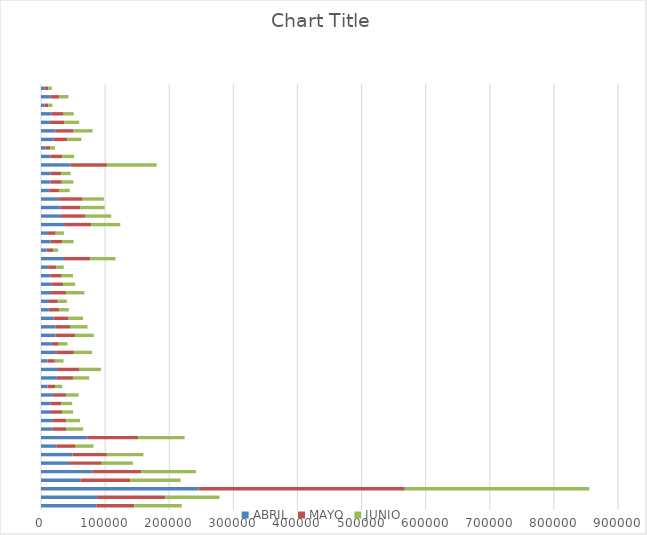
| Category | ABRIL | MAYO | JUNIO |
|---|---|---|---|
| 0 | 86225 | 59291 | 74128 |
| 1 | 88792 | 104839 | 84714 |
| 2 | 245872 | 321637 | 287723 |
| 3 | 61897 | 77159 | 78760 |
| 4 | 80103 | 75978 | 85643 |
| 5 | 43756 | 50997 | 48631 |
| 6 | 49025 | 53799 | 56860 |
| 7 | 24566 | 29308 | 28075 |
| 8 | 72175 | 79440 | 72378 |
| 9 | 17647 | 22268 | 25756 |
| 10 | 18534 | 20859 | 21446 |
| 11 | 15484 | 17320 | 17343 |
| 12 | 15157 | 16817 | 16644 |
| 13 | 18486 | 20451 | 19843 |
| 14 | 10235 | 11541 | 11129 |
| 15 | 24727 | 25111 | 25236 |
| 16 | 26568 | 32729 | 34204 |
| 17 | 9833 | 11752 | 13587 |
| 18 | 23521 | 27748 | 28431 |
| 19 | 16677 | 10917 | 13701 |
| 20 | 22634 | 31226 | 28515 |
| 21 | 22764 | 22472 | 27422 |
| 22 | 19506 | 22751 | 23171 |
| 23 | 12160 | 16334 | 14935 |
| 24 | 12395 | 13765 | 14204 |
| 25 | 15525 | 24156 | 27900 |
| 26 | 15955 | 18739 | 18482 |
| 27 | 14685 | 17695 | 17401 |
| 28 | 11313 | 12295 | 11861 |
| 29 | 35905 | 40641 | 39746 |
| 30 | 8773 | 9931 | 8058 |
| 31 | 14985 | 18104 | 17734 |
| 32 | 10891 | 12007 | 12739 |
| 33 | 37542 | 40806 | 45301 |
| 34 | 31139 | 37465 | 40890 |
| 35 | 30650 | 31029 | 37550 |
| 36 | 28268 | 36654 | 33140 |
| 37 | 12865 | 15134 | 16903 |
| 38 | 14832 | 17660 | 18005 |
| 39 | 14505 | 16748 | 14774 |
| 40 | 46043 | 57431 | 76914 |
| 41 | 15020 | 18138 | 18340 |
| 42 | 6774 | 7507 | 7499 |
| 43 | 19048 | 21789 | 22202 |
| 44 | 22983 | 27884 | 29571 |
| 45 | 13841 | 22243 | 23487 |
| 46 | 16269 | 18027 | 16702 |
| 47 | 5438 | 6095 | 6132 |
| 48 | 14589 | 13743 | 14452 |
| 49 | 5368 | 5919 | 5666 |